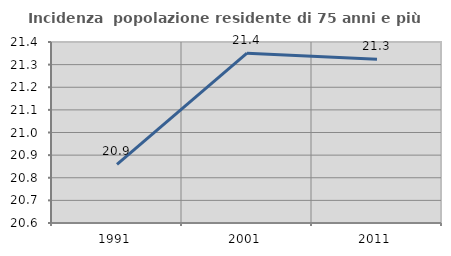
| Category | Incidenza  popolazione residente di 75 anni e più |
|---|---|
| 1991.0 | 20.859 |
| 2001.0 | 21.351 |
| 2011.0 | 21.324 |